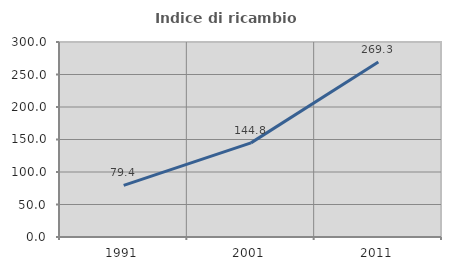
| Category | Indice di ricambio occupazionale  |
|---|---|
| 1991.0 | 79.442 |
| 2001.0 | 144.828 |
| 2011.0 | 269.323 |